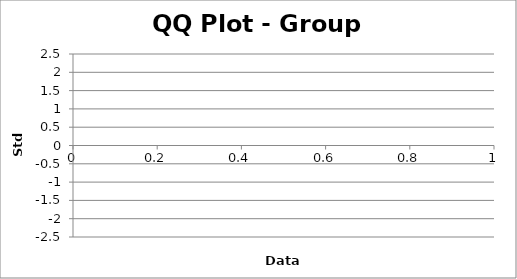
| Category | Series 0 |
|---|---|
| 0.0 | -1.834 |
| 0.0 | -1.282 |
| 0.0 | -0.967 |
| 0.0 | -0.728 |
| 0.0 | -0.524 |
| 0.0 | -0.341 |
| 0.0 | -0.168 |
| 0.0 | 0 |
| 0.0 | 0.168 |
| 0.0 | 0.341 |
| 0.0 | 0.524 |
| 0.0 | 0.728 |
| 0.0 | 0.967 |
| 0.0 | 1.282 |
| 0.0 | 1.834 |